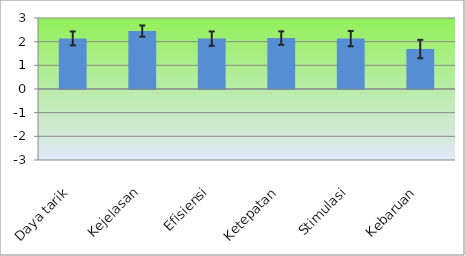
| Category | Series 0 |
|---|---|
| Daya tarik | 2.136 |
| Kejelasan | 2.447 |
| Efisiensi | 2.129 |
| Ketepatan | 2.152 |
| Stimulasi | 2.129 |
| Kebaruan | 1.689 |